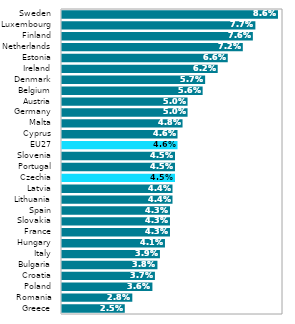
| Category | Series 0 |
|---|---|
| Greece | 0.025 |
| Romania | 0.028 |
| Poland | 0.036 |
| Croatia | 0.037 |
| Bulgaria | 0.038 |
| Italy | 0.039 |
| Hungary | 0.041 |
| France | 0.043 |
| Slovakia | 0.043 |
| Spain | 0.043 |
| Lithuania | 0.044 |
| Latvia | 0.044 |
| Czechia | 0.045 |
| Portugal | 0.045 |
| Slovenia | 0.045 |
| EU27 | 0.046 |
| Cyprus | 0.046 |
| Malta | 0.048 |
| Germany | 0.05 |
| Austria | 0.05 |
| Belgium | 0.056 |
| Denmark | 0.057 |
| Ireland | 0.062 |
| Estonia | 0.066 |
| Netherlands | 0.072 |
| Finland | 0.076 |
| Luxembourg | 0.077 |
| Sweden | 0.086 |